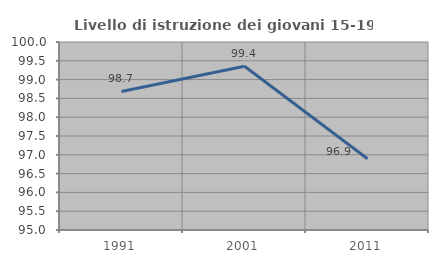
| Category | Livello di istruzione dei giovani 15-19 anni |
|---|---|
| 1991.0 | 98.684 |
| 2001.0 | 99.355 |
| 2011.0 | 96.894 |